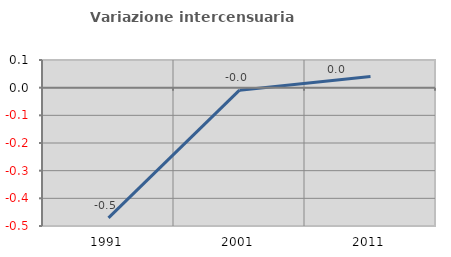
| Category | Variazione intercensuaria annua |
|---|---|
| 1991.0 | -0.471 |
| 2001.0 | -0.009 |
| 2011.0 | 0.04 |